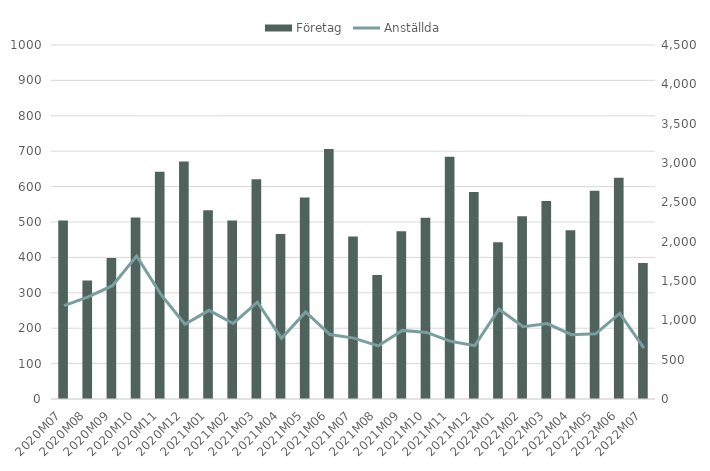
| Category | Företag |
|---|---|
| 2020M07 | 504 |
| 2020M08 | 335 |
| 2020M09 | 398 |
| 2020M10 | 513 |
| 2020M11 | 642 |
| 2020M12 | 671 |
| 2021M01 | 533 |
| 2021M02 | 504 |
| 2021M03 | 621 |
| 2021M04 | 466 |
| 2021M05 | 569 |
| 2021M06 | 706 |
| 2021M07 | 459 |
| 2021M08 | 350 |
| 2021M09 | 474 |
| 2021M10 | 512 |
| 2021M11 | 684 |
| 2021M12 | 585 |
| 2022M01 | 443 |
| 2022M02 | 516 |
| 2022M03 | 559 |
| 2022M04 | 477 |
| 2022M05 | 588 |
| 2022M06 | 625 |
| 2022M07 | 384 |